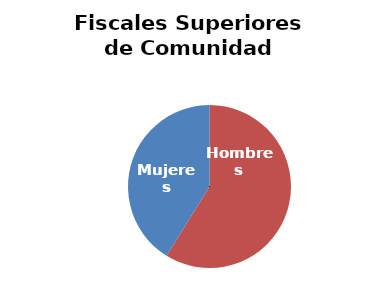
| Category | Fiscales Superiores de Comunidad Autónoma |
|---|---|
| Hombres | 10 |
| Mujeres | 7 |